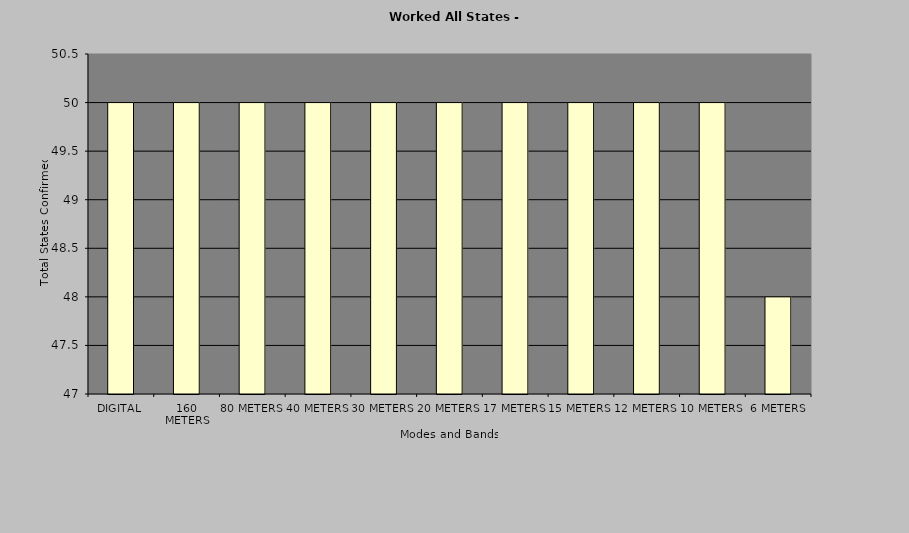
| Category | Series 0 |
|---|---|
| DIGITAL | 50 |
| 160 METERS | 50 |
| 80 METERS | 50 |
| 40 METERS | 50 |
| 30 METERS | 50 |
| 20 METERS | 50 |
| 17 METERS | 50 |
| 15 METERS | 50 |
| 12 METERS | 50 |
| 10 METERS | 50 |
| 6 METERS | 48 |